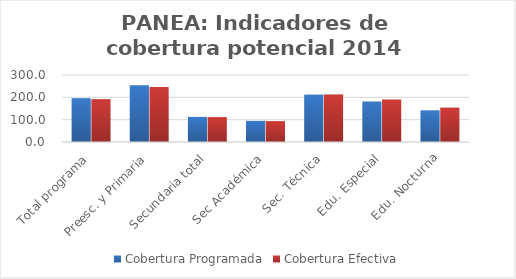
| Category | Cobertura Programada | Cobertura Efectiva |
|---|---|---|
| Total programa | 196.059 | 191.992 |
| Preesc. y Primaria | 253.961 | 246.763 |
| Secundaria total | 112.332 | 111.468 |
| Sec Académica | 94.625 | 93.572 |
| Sec. Técnica | 212.017 | 212.218 |
| Edu. Especial | 181.089 | 190.406 |
| Edu. Nocturna | 141.883 | 153.838 |